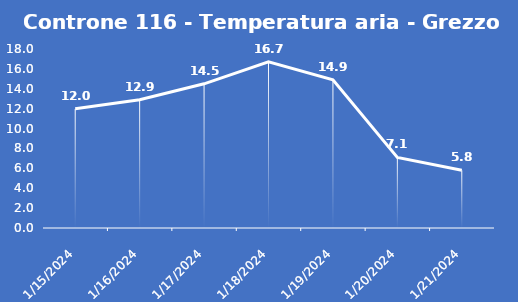
| Category | Controne 116 - Temperatura aria - Grezzo (°C) |
|---|---|
| 1/15/24 | 12 |
| 1/16/24 | 12.9 |
| 1/17/24 | 14.5 |
| 1/18/24 | 16.7 |
| 1/19/24 | 14.9 |
| 1/20/24 | 7.1 |
| 1/21/24 | 5.8 |